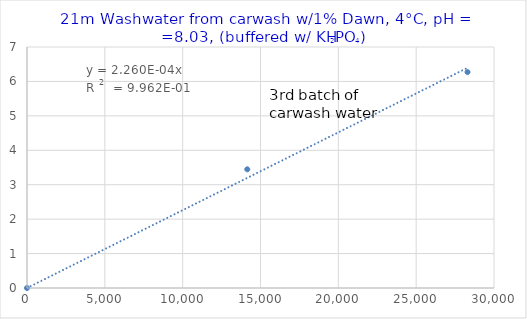
| Category | Series 0 |
|---|---|
| 0.0 | 0 |
| 14149.076517150397 | 3.447 |
| 28298.153034300794 | 6.271 |